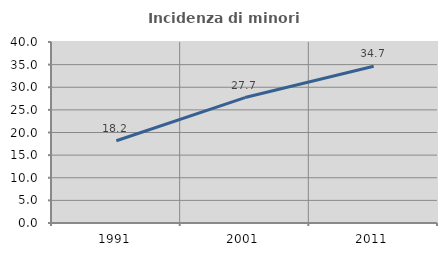
| Category | Incidenza di minori stranieri |
|---|---|
| 1991.0 | 18.182 |
| 2001.0 | 27.723 |
| 2011.0 | 34.657 |